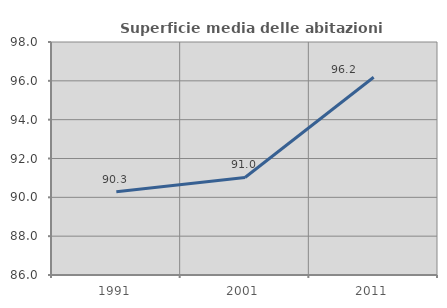
| Category | Superficie media delle abitazioni occupate |
|---|---|
| 1991.0 | 90.288 |
| 2001.0 | 91.024 |
| 2011.0 | 96.182 |